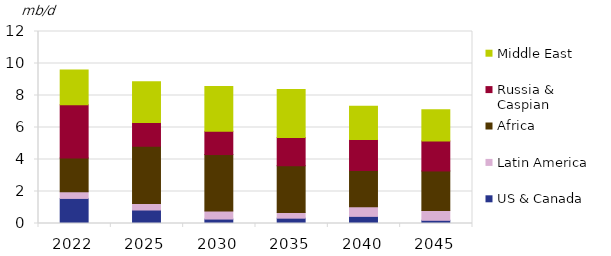
| Category | US & Canada | Latin America | Africa | Russia & Caspian | Middle East |
|---|---|---|---|---|---|
| 2022.0 | 1.567 | 0.421 | 2.1 | 3.341 | 2.17 |
| 2025.0 | 0.843 | 0.4 | 3.585 | 1.488 | 2.539 |
| 2030.0 | 0.276 | 0.512 | 3.521 | 1.454 | 2.791 |
| 2035.0 | 0.333 | 0.347 | 2.931 | 1.767 | 2.996 |
| 2040.0 | 0.445 | 0.594 | 2.267 | 1.939 | 2.09 |
| 2045.0 | 0.2 | 0.608 | 2.476 | 1.873 | 1.945 |